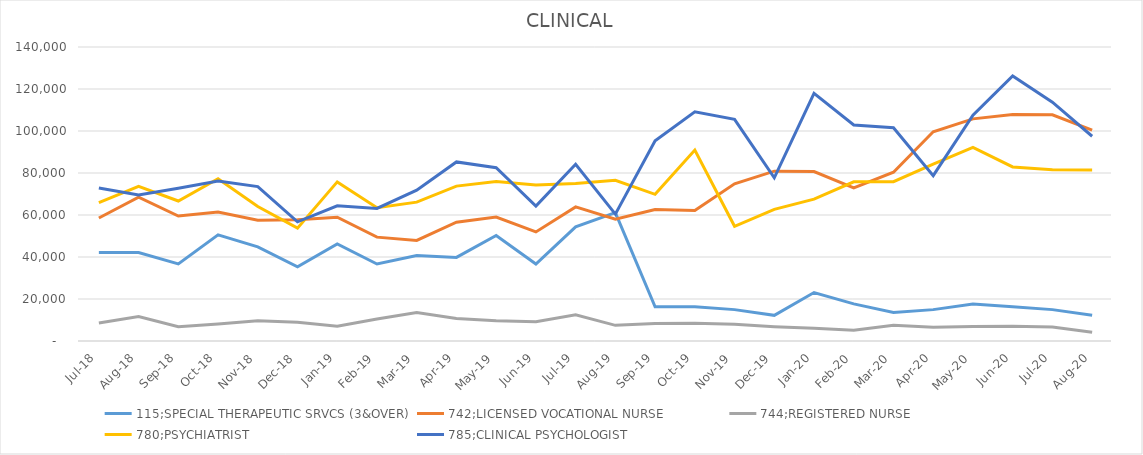
| Category | 115;SPECIAL THERAPEUTIC SRVCS (3&OVER) | 742;LICENSED VOCATIONAL NURSE | 744;REGISTERED NURSE | 780;PSYCHIATRIST | 785;CLINICAL PSYCHOLOGIST |
|---|---|---|---|---|---|
| Jul-18 | 42109.78 | 58569.3 | 8599.74 | 65850 | 72817.86 |
| Aug-18 | 42109.78 | 68474.24 | 11692.69 | 73600 | 69481.26 |
| Sep-18 | 36676.26 | 59495.83 | 6828.64 | 66675 | 72785.03 |
| Oct-18 | 50531.78 | 61392.98 | 8126.38 | 77275 | 76236.59 |
| Nov-18 | 44826.54 | 57532.48 | 9686 | 64025 | 73525.14 |
| Dec-18 | 35317.88 | 57753.08 | 8940.92 | 53750 | 56776.5 |
| Jan-19 | 46184.92 | 58922.26 | 7035.51 | 75775 | 64381.8 |
| Feb-19 | 36676.26 | 49458.52 | 10456.92 | 63500 | 63131.8 |
| Mar-19 | 40751.4 | 47914.32 | 13540.52 | 66125 | 71829.15 |
| Apr-19 | 39800.54 | 56583.9 | 10748.32 | 73750 | 85283.53 |
| May-19 | 50260.06 | 59032.56 | 9588.26 | 75925 | 82487.1 |
| Jun-19 | 36676.26 | 51951.3 | 9189.9 | 74250 | 64276.5 |
| Jul-19 | 54335.2 | 63863.7 | 12502.8 | 74950 | 84171.2 |
| Aug-19 | 61127.1 | 57973.68 | 7445.22 | 76500 | 60421.2 |
| Sep-19 | 16300.56 | 62650.4 | 8352.62 | 69850 | 95367.09 |
| Oct-19 | 16300.56 | 62165.08 | 8450.36 | 90925 | 109171.2 |
| Nov-19 | 14942.18 | 74849.58 | 7972.7 | 54625 | 105526.5 |
| Dec-19 | 12225.42 | 80871.96 | 6824.34 | 62675 | 77710.6 |
| Jan-20 | 23092.46 | 80673.42 | 6041.76 | 67550 | 117921.2 |
| Feb-20 | 17658.94 | 72890.65 | 5076.6 | 75775 | 102868.55 |
| Mar-20 | 13583.8 | 80364.58 | 7504.26 | 75875 | 101565.9 |
| Apr-20 | 14942.18 | 99645.02 | 6491.76 | 84175 | 78750 |
| May-20 | 17658.94 | 105777.7 | 6899.34 | 92225 | 107500 |
| Jun-20 | 16300.56 | 107895.46 | 7015.52 | 82875 | 126250 |
| Jul-20 | 14942.18 | 107741.04 | 6711.22 | 81500 | 113750 |
| Aug-20 | 12225.42 | 100439.18 | 4186.44 | 81375 | 97500 |